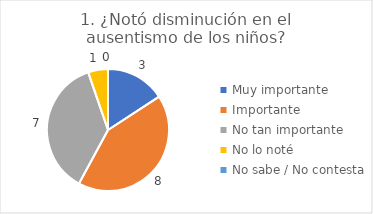
| Category | 1. ¿Notó disminución en el ausentismo de los niños? |
|---|---|
| Muy importante  | 0.158 |
| Importante  | 0.421 |
| No tan importante  | 0.368 |
| No lo noté  | 0.053 |
| No sabe / No contesta | 0 |